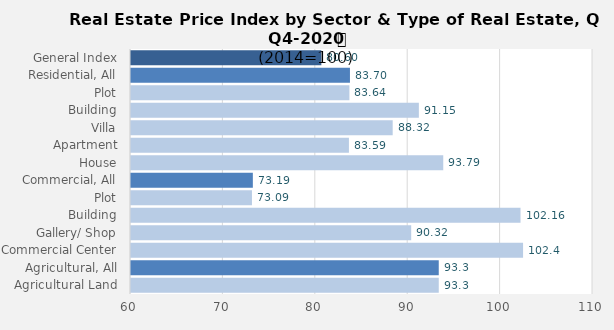
| Category | 2020 |
|---|---|
| General Index | 80.6 |
| Residential, All | 83.696 |
| Plot | 83.636 |
| Building | 91.154 |
| Villa | 88.321 |
| Apartment | 83.585 |
| House | 93.793 |
| Commercial, All | 73.187 |
| Plot | 73.09 |
| Building | 102.156 |
| Gallery/ Shop | 90.324 |
| Commercial Center | 102.432 |
| Agricultural, All | 93.307 |
| Agricultural Land | 93.307 |